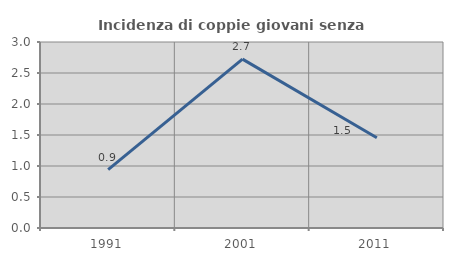
| Category | Incidenza di coppie giovani senza figli |
|---|---|
| 1991.0 | 0.94 |
| 2001.0 | 2.724 |
| 2011.0 | 1.456 |